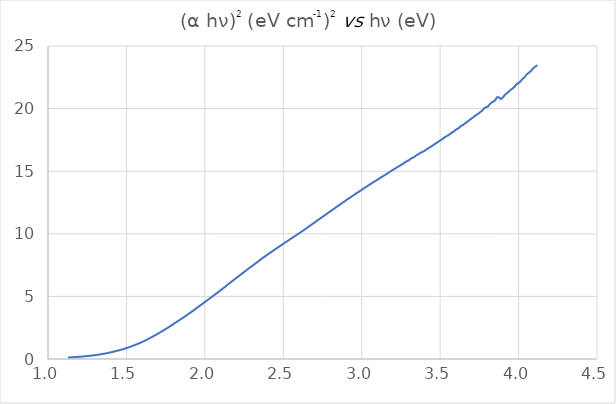
| Category | Series 0 |
|---|---|
| 1.12727 | 0.115 |
| 1.1283 | 0.116 |
| 1.12933 | 0.116 |
| 1.13036 | 0.117 |
| 1.13139 | 0.118 |
| 1.13242 | 0.119 |
| 1.13346 | 0.12 |
| 1.13449 | 0.12 |
| 1.13553 | 0.121 |
| 1.13657 | 0.122 |
| 1.13761 | 0.123 |
| 1.13866 | 0.123 |
| 1.13971 | 0.124 |
| 1.14075 | 0.125 |
| 1.1418 | 0.126 |
| 1.14286 | 0.126 |
| 1.14391 | 0.127 |
| 1.14497 | 0.128 |
| 1.14603 | 0.129 |
| 1.14709 | 0.13 |
| 1.14815 | 0.131 |
| 1.14921 | 0.131 |
| 1.15028 | 0.132 |
| 1.15135 | 0.133 |
| 1.15242 | 0.134 |
| 1.15349 | 0.135 |
| 1.15456 | 0.136 |
| 1.15564 | 0.137 |
| 1.15672 | 0.137 |
| 1.1578 | 0.138 |
| 1.15888 | 0.139 |
| 1.15996 | 0.14 |
| 1.16105 | 0.141 |
| 1.16214 | 0.142 |
| 1.16323 | 0.143 |
| 1.16432 | 0.144 |
| 1.16541 | 0.145 |
| 1.16651 | 0.146 |
| 1.16761 | 0.147 |
| 1.16871 | 0.148 |
| 1.16981 | 0.149 |
| 1.17092 | 0.15 |
| 1.17202 | 0.151 |
| 1.17313 | 0.152 |
| 1.17424 | 0.153 |
| 1.17536 | 0.154 |
| 1.17647 | 0.155 |
| 1.17759 | 0.156 |
| 1.17871 | 0.157 |
| 1.17983 | 0.158 |
| 1.18095 | 0.159 |
| 1.18208 | 0.16 |
| 1.18321 | 0.161 |
| 1.18434 | 0.162 |
| 1.18547 | 0.163 |
| 1.1866 | 0.164 |
| 1.18774 | 0.165 |
| 1.18888 | 0.166 |
| 1.19002 | 0.167 |
| 1.19116 | 0.168 |
| 1.19231 | 0.169 |
| 1.19346 | 0.171 |
| 1.19461 | 0.172 |
| 1.19576 | 0.173 |
| 1.19691 | 0.174 |
| 1.19807 | 0.175 |
| 1.19923 | 0.176 |
| 1.20039 | 0.177 |
| 1.20155 | 0.178 |
| 1.20272 | 0.18 |
| 1.20388 | 0.181 |
| 1.20505 | 0.182 |
| 1.20623 | 0.183 |
| 1.2074 | 0.184 |
| 1.20858 | 0.185 |
| 1.20976 | 0.187 |
| 1.21094 | 0.188 |
| 1.21212 | 0.189 |
| 1.21331 | 0.19 |
| 1.2145 | 0.192 |
| 1.21569 | 0.193 |
| 1.21688 | 0.194 |
| 1.21807 | 0.195 |
| 1.21927 | 0.197 |
| 1.22047 | 0.198 |
| 1.22167 | 0.199 |
| 1.22288 | 0.201 |
| 1.22409 | 0.202 |
| 1.2253 | 0.203 |
| 1.22651 | 0.205 |
| 1.22772 | 0.207 |
| 1.22894 | 0.208 |
| 1.23016 | 0.21 |
| 1.23138 | 0.211 |
| 1.2326 | 0.213 |
| 1.23383 | 0.214 |
| 1.23506 | 0.215 |
| 1.23629 | 0.217 |
| 1.23752 | 0.218 |
| 1.23876 | 0.22 |
| 1.24 | 0.221 |
| 1.24124 | 0.223 |
| 1.24248 | 0.224 |
| 1.24373 | 0.226 |
| 1.24498 | 0.227 |
| 1.24623 | 0.229 |
| 1.24748 | 0.23 |
| 1.24874 | 0.232 |
| 1.25 | 0.234 |
| 1.25126 | 0.235 |
| 1.25253 | 0.237 |
| 1.25379 | 0.239 |
| 1.25506 | 0.24 |
| 1.25633 | 0.242 |
| 1.25761 | 0.244 |
| 1.25888 | 0.245 |
| 1.26016 | 0.247 |
| 1.26144 | 0.249 |
| 1.26273 | 0.25 |
| 1.26402 | 0.252 |
| 1.26531 | 0.254 |
| 1.2666 | 0.256 |
| 1.26789 | 0.257 |
| 1.26919 | 0.259 |
| 1.27049 | 0.261 |
| 1.27179 | 0.263 |
| 1.2731 | 0.265 |
| 1.27441 | 0.267 |
| 1.27572 | 0.268 |
| 1.27703 | 0.27 |
| 1.27835 | 0.272 |
| 1.27967 | 0.274 |
| 1.28099 | 0.276 |
| 1.28232 | 0.278 |
| 1.28364 | 0.28 |
| 1.28497 | 0.282 |
| 1.28631 | 0.284 |
| 1.28764 | 0.286 |
| 1.28898 | 0.288 |
| 1.29032 | 0.29 |
| 1.29167 | 0.293 |
| 1.29301 | 0.295 |
| 1.29436 | 0.297 |
| 1.29572 | 0.299 |
| 1.29707 | 0.301 |
| 1.29843 | 0.305 |
| 1.29979 | 0.307 |
| 1.30115 | 0.31 |
| 1.30252 | 0.312 |
| 1.30389 | 0.314 |
| 1.30526 | 0.316 |
| 1.30664 | 0.319 |
| 1.30802 | 0.321 |
| 1.3094 | 0.324 |
| 1.31078 | 0.326 |
| 1.31217 | 0.328 |
| 1.31356 | 0.331 |
| 1.31495 | 0.333 |
| 1.31635 | 0.336 |
| 1.31775 | 0.338 |
| 1.31915 | 0.341 |
| 1.32055 | 0.344 |
| 1.32196 | 0.346 |
| 1.32337 | 0.349 |
| 1.32479 | 0.352 |
| 1.3262 | 0.354 |
| 1.32762 | 0.357 |
| 1.32905 | 0.36 |
| 1.33047 | 0.363 |
| 1.3319 | 0.366 |
| 1.33333 | 0.369 |
| 1.33477 | 0.371 |
| 1.33621 | 0.374 |
| 1.33765 | 0.377 |
| 1.33909 | 0.38 |
| 1.34054 | 0.383 |
| 1.34199 | 0.386 |
| 1.34345 | 0.39 |
| 1.3449 | 0.393 |
| 1.34636 | 0.396 |
| 1.34783 | 0.399 |
| 1.34929 | 0.402 |
| 1.35076 | 0.405 |
| 1.35224 | 0.409 |
| 1.35371 | 0.412 |
| 1.35519 | 0.416 |
| 1.35667 | 0.419 |
| 1.35816 | 0.422 |
| 1.35965 | 0.426 |
| 1.36114 | 0.43 |
| 1.36264 | 0.433 |
| 1.36414 | 0.437 |
| 1.36564 | 0.441 |
| 1.36714 | 0.444 |
| 1.36865 | 0.448 |
| 1.37017 | 0.452 |
| 1.37168 | 0.456 |
| 1.3732 | 0.46 |
| 1.37472 | 0.463 |
| 1.37625 | 0.467 |
| 1.37778 | 0.471 |
| 1.37931 | 0.477 |
| 1.38085 | 0.481 |
| 1.38239 | 0.485 |
| 1.38393 | 0.489 |
| 1.38547 | 0.493 |
| 1.38702 | 0.498 |
| 1.38858 | 0.502 |
| 1.39013 | 0.506 |
| 1.39169 | 0.51 |
| 1.39326 | 0.515 |
| 1.39483 | 0.519 |
| 1.3964 | 0.523 |
| 1.39797 | 0.528 |
| 1.39955 | 0.532 |
| 1.40113 | 0.536 |
| 1.40271 | 0.541 |
| 1.4043 | 0.546 |
| 1.4059 | 0.55 |
| 1.40749 | 0.555 |
| 1.40909 | 0.559 |
| 1.41069 | 0.564 |
| 1.4123 | 0.569 |
| 1.41391 | 0.574 |
| 1.41553 | 0.579 |
| 1.41714 | 0.583 |
| 1.41876 | 0.588 |
| 1.42039 | 0.593 |
| 1.42202 | 0.598 |
| 1.42365 | 0.603 |
| 1.42529 | 0.607 |
| 1.42693 | 0.612 |
| 1.42857 | 0.617 |
| 1.43022 | 0.622 |
| 1.43187 | 0.627 |
| 1.43353 | 0.634 |
| 1.43519 | 0.641 |
| 1.43685 | 0.647 |
| 1.43852 | 0.652 |
| 1.44019 | 0.657 |
| 1.44186 | 0.662 |
| 1.44354 | 0.668 |
| 1.44522 | 0.673 |
| 1.44691 | 0.679 |
| 1.4486 | 0.684 |
| 1.45029 | 0.69 |
| 1.45199 | 0.695 |
| 1.45369 | 0.701 |
| 1.4554 | 0.707 |
| 1.45711 | 0.713 |
| 1.45882 | 0.719 |
| 1.46054 | 0.724 |
| 1.46226 | 0.73 |
| 1.46399 | 0.736 |
| 1.46572 | 0.742 |
| 1.46746 | 0.748 |
| 1.46919 | 0.754 |
| 1.47094 | 0.76 |
| 1.47268 | 0.765 |
| 1.47444 | 0.772 |
| 1.47619 | 0.778 |
| 1.47795 | 0.785 |
| 1.47971 | 0.792 |
| 1.48148 | 0.799 |
| 1.48325 | 0.806 |
| 1.48503 | 0.813 |
| 1.48681 | 0.82 |
| 1.4886 | 0.827 |
| 1.49038 | 0.834 |
| 1.49218 | 0.841 |
| 1.49398 | 0.848 |
| 1.49578 | 0.856 |
| 1.49758 | 0.863 |
| 1.4994 | 0.869 |
| 1.50121 | 0.877 |
| 1.50303 | 0.884 |
| 1.50485 | 0.891 |
| 1.50668 | 0.898 |
| 1.50852 | 0.906 |
| 1.51035 | 0.913 |
| 1.5122 | 0.92 |
| 1.51404 | 0.928 |
| 1.51589 | 0.936 |
| 1.51775 | 0.944 |
| 1.51961 | 0.951 |
| 1.52147 | 0.959 |
| 1.52334 | 0.968 |
| 1.52522 | 0.976 |
| 1.52709 | 0.984 |
| 1.52898 | 0.992 |
| 1.53086 | 1.005 |
| 1.53276 | 1.015 |
| 1.53465 | 1.024 |
| 1.53656 | 1.032 |
| 1.53846 | 1.041 |
| 1.54037 | 1.05 |
| 1.54229 | 1.059 |
| 1.54421 | 1.068 |
| 1.54613 | 1.077 |
| 1.54806 | 1.086 |
| 1.55 | 1.095 |
| 1.55194 | 1.105 |
| 1.55388 | 1.114 |
| 1.55583 | 1.124 |
| 1.55779 | 1.134 |
| 1.55975 | 1.144 |
| 1.56171 | 1.154 |
| 1.56368 | 1.164 |
| 1.56566 | 1.175 |
| 1.56764 | 1.185 |
| 1.56962 | 1.195 |
| 1.57161 | 1.205 |
| 1.5736 | 1.215 |
| 1.5756 | 1.226 |
| 1.57761 | 1.236 |
| 1.57962 | 1.247 |
| 1.58163 | 1.258 |
| 1.58365 | 1.269 |
| 1.58568 | 1.28 |
| 1.58771 | 1.291 |
| 1.58974 | 1.302 |
| 1.59178 | 1.313 |
| 1.59383 | 1.325 |
| 1.59588 | 1.336 |
| 1.59794 | 1.348 |
| 1.6 | 1.359 |
| 1.60207 | 1.371 |
| 1.60414 | 1.383 |
| 1.60622 | 1.396 |
| 1.6083 | 1.407 |
| 1.61039 | 1.42 |
| 1.61248 | 1.432 |
| 1.61458 | 1.445 |
| 1.61669 | 1.457 |
| 1.6188 | 1.47 |
| 1.62092 | 1.483 |
| 1.62304 | 1.496 |
| 1.62516 | 1.508 |
| 1.6273 | 1.521 |
| 1.62943 | 1.535 |
| 1.63158 | 1.548 |
| 1.63373 | 1.562 |
| 1.63588 | 1.575 |
| 1.63804 | 1.589 |
| 1.64021 | 1.601 |
| 1.64238 | 1.622 |
| 1.64456 | 1.639 |
| 1.64675 | 1.653 |
| 1.64894 | 1.667 |
| 1.65113 | 1.682 |
| 1.65333 | 1.696 |
| 1.65554 | 1.711 |
| 1.65775 | 1.726 |
| 1.65997 | 1.741 |
| 1.6622 | 1.756 |
| 1.66443 | 1.771 |
| 1.66667 | 1.786 |
| 1.66891 | 1.801 |
| 1.67116 | 1.816 |
| 1.67341 | 1.832 |
| 1.67568 | 1.848 |
| 1.67794 | 1.864 |
| 1.68022 | 1.88 |
| 1.6825 | 1.896 |
| 1.68478 | 1.912 |
| 1.68707 | 1.928 |
| 1.68937 | 1.945 |
| 1.69168 | 1.961 |
| 1.69399 | 1.977 |
| 1.69631 | 1.994 |
| 1.69863 | 2.01 |
| 1.70096 | 2.027 |
| 1.7033 | 2.044 |
| 1.70564 | 2.061 |
| 1.70799 | 2.078 |
| 1.71034 | 2.094 |
| 1.71271 | 2.112 |
| 1.71508 | 2.129 |
| 1.71745 | 2.147 |
| 1.71983 | 2.164 |
| 1.72222 | 2.181 |
| 1.72462 | 2.199 |
| 1.72702 | 2.217 |
| 1.72943 | 2.235 |
| 1.73184 | 2.253 |
| 1.73427 | 2.272 |
| 1.73669 | 2.29 |
| 1.73913 | 2.309 |
| 1.74157 | 2.327 |
| 1.74402 | 2.346 |
| 1.74648 | 2.365 |
| 1.74894 | 2.383 |
| 1.75141 | 2.403 |
| 1.75389 | 2.422 |
| 1.75637 | 2.441 |
| 1.75887 | 2.46 |
| 1.76136 | 2.48 |
| 1.76387 | 2.499 |
| 1.76638 | 2.518 |
| 1.7689 | 2.537 |
| 1.77143 | 2.556 |
| 1.77396 | 2.58 |
| 1.7765 | 2.6 |
| 1.77905 | 2.62 |
| 1.78161 | 2.64 |
| 1.78417 | 2.66 |
| 1.78674 | 2.68 |
| 1.78932 | 2.701 |
| 1.79191 | 2.721 |
| 1.7945 | 2.742 |
| 1.7971 | 2.77 |
| 1.79971 | 2.796 |
| 1.80233 | 2.817 |
| 1.80495 | 2.838 |
| 1.80758 | 2.86 |
| 1.81022 | 2.881 |
| 1.81287 | 2.903 |
| 1.81552 | 2.925 |
| 1.81818 | 2.946 |
| 1.82085 | 2.968 |
| 1.82353 | 2.99 |
| 1.82622 | 3.012 |
| 1.82891 | 3.034 |
| 1.83161 | 3.056 |
| 1.83432 | 3.078 |
| 1.83704 | 3.101 |
| 1.83976 | 3.124 |
| 1.8425 | 3.147 |
| 1.84524 | 3.169 |
| 1.84799 | 3.192 |
| 1.85075 | 3.215 |
| 1.85351 | 3.238 |
| 1.85629 | 3.261 |
| 1.85907 | 3.284 |
| 1.86186 | 3.308 |
| 1.86466 | 3.332 |
| 1.86747 | 3.356 |
| 1.87029 | 3.38 |
| 1.87311 | 3.405 |
| 1.87595 | 3.429 |
| 1.87879 | 3.453 |
| 1.88164 | 3.477 |
| 1.8845 | 3.502 |
| 1.88737 | 3.527 |
| 1.89024 | 3.552 |
| 1.89313 | 3.578 |
| 1.89602 | 3.603 |
| 1.89893 | 3.628 |
| 1.90184 | 3.654 |
| 1.90476 | 3.679 |
| 1.90769 | 3.705 |
| 1.91063 | 3.73 |
| 1.91358 | 3.756 |
| 1.91654 | 3.782 |
| 1.9195 | 3.808 |
| 1.92248 | 3.834 |
| 1.92547 | 3.86 |
| 1.92846 | 3.887 |
| 1.93146 | 3.914 |
| 1.93448 | 3.941 |
| 1.9375 | 3.968 |
| 1.94053 | 3.995 |
| 1.94357 | 4.023 |
| 1.94662 | 4.05 |
| 1.94969 | 4.077 |
| 1.95276 | 4.104 |
| 1.95584 | 4.145 |
| 1.95893 | 4.175 |
| 1.96203 | 4.203 |
| 1.96513 | 4.232 |
| 1.96825 | 4.26 |
| 1.97138 | 4.289 |
| 1.97452 | 4.317 |
| 1.97767 | 4.346 |
| 1.98083 | 4.375 |
| 1.984 | 4.404 |
| 1.98718 | 4.433 |
| 1.99037 | 4.462 |
| 1.99357 | 4.491 |
| 1.99678 | 4.52 |
| 2.0 | 4.549 |
| 2.00323 | 4.58 |
| 2.00647 | 4.609 |
| 2.00972 | 4.64 |
| 2.01299 | 4.669 |
| 2.01626 | 4.699 |
| 2.01954 | 4.73 |
| 2.02284 | 4.76 |
| 2.02614 | 4.791 |
| 2.02946 | 4.822 |
| 2.03279 | 4.853 |
| 2.03612 | 4.884 |
| 2.03947 | 4.915 |
| 2.04283 | 4.947 |
| 2.0462 | 4.979 |
| 2.04959 | 5.011 |
| 2.05298 | 5.043 |
| 2.05638 | 5.075 |
| 2.0598 | 5.107 |
| 2.06323 | 5.139 |
| 2.06667 | 5.172 |
| 2.07012 | 5.204 |
| 2.07358 | 5.237 |
| 2.07705 | 5.27 |
| 2.08054 | 5.302 |
| 2.08403 | 5.335 |
| 2.08754 | 5.368 |
| 2.09106 | 5.401 |
| 2.09459 | 5.435 |
| 2.09814 | 5.468 |
| 2.10169 | 5.502 |
| 2.10526 | 5.535 |
| 2.10884 | 5.57 |
| 2.11244 | 5.604 |
| 2.11604 | 5.639 |
| 2.11966 | 5.673 |
| 2.12329 | 5.708 |
| 2.12693 | 5.743 |
| 2.13058 | 5.778 |
| 2.13425 | 5.813 |
| 2.13793 | 5.851 |
| 2.14162 | 5.9 |
| 2.14533 | 5.936 |
| 2.14905 | 5.972 |
| 2.15278 | 6.008 |
| 2.15652 | 6.045 |
| 2.16028 | 6.083 |
| 2.16405 | 6.118 |
| 2.16783 | 6.154 |
| 2.17163 | 6.192 |
| 2.17544 | 6.228 |
| 2.17926 | 6.264 |
| 2.1831 | 6.304 |
| 2.18695 | 6.339 |
| 2.19081 | 6.377 |
| 2.19469 | 6.413 |
| 2.19858 | 6.451 |
| 2.20249 | 6.49 |
| 2.20641 | 6.527 |
| 2.21034 | 6.563 |
| 2.21429 | 6.604 |
| 2.21825 | 6.64 |
| 2.22222 | 6.679 |
| 2.22621 | 6.719 |
| 2.23022 | 6.756 |
| 2.23423 | 6.796 |
| 2.23827 | 6.835 |
| 2.24231 | 6.873 |
| 2.24638 | 6.912 |
| 2.25045 | 6.951 |
| 2.25455 | 6.99 |
| 2.25865 | 7.029 |
| 2.26277 | 7.067 |
| 2.26691 | 7.107 |
| 2.27106 | 7.147 |
| 2.27523 | 7.187 |
| 2.27941 | 7.228 |
| 2.28361 | 7.267 |
| 2.28782 | 7.306 |
| 2.29205 | 7.347 |
| 2.2963 | 7.386 |
| 2.30056 | 7.425 |
| 2.30483 | 7.465 |
| 2.30912 | 7.505 |
| 2.31343 | 7.544 |
| 2.31776 | 7.584 |
| 2.3221 | 7.625 |
| 2.32645 | 7.665 |
| 2.33083 | 7.707 |
| 2.33522 | 7.747 |
| 2.33962 | 7.788 |
| 2.34405 | 7.83 |
| 2.34848 | 7.871 |
| 2.35294 | 7.912 |
| 2.35741 | 7.953 |
| 2.3619 | 8 |
| 2.36641 | 8.046 |
| 2.37094 | 8.087 |
| 2.37548 | 8.126 |
| 2.38004 | 8.167 |
| 2.38462 | 8.209 |
| 2.38921 | 8.25 |
| 2.39382 | 8.289 |
| 2.39845 | 8.329 |
| 2.4031 | 8.37 |
| 2.40777 | 8.41 |
| 2.41245 | 8.449 |
| 2.41715 | 8.488 |
| 2.42188 | 8.53 |
| 2.42661 | 8.573 |
| 2.43137 | 8.616 |
| 2.43615 | 8.659 |
| 2.44094 | 8.702 |
| 2.44576 | 8.744 |
| 2.45059 | 8.785 |
| 2.45545 | 8.827 |
| 2.46032 | 8.868 |
| 2.46521 | 8.911 |
| 2.47012 | 8.95 |
| 2.47505 | 8.989 |
| 2.48 | 9.032 |
| 2.48497 | 9.073 |
| 2.48996 | 9.115 |
| 2.49497 | 9.155 |
| 2.5 | 9.198 |
| 2.50505 | 9.243 |
| 2.51012 | 9.285 |
| 2.51521 | 9.327 |
| 2.52033 | 9.372 |
| 2.52546 | 9.414 |
| 2.53061 | 9.455 |
| 2.53579 | 9.501 |
| 2.54098 | 9.544 |
| 2.5462 | 9.587 |
| 2.55144 | 9.632 |
| 2.5567 | 9.672 |
| 2.56198 | 9.719 |
| 2.56729 | 9.761 |
| 2.57261 | 9.807 |
| 2.57796 | 9.849 |
| 2.58333 | 9.893 |
| 2.58873 | 9.938 |
| 2.59414 | 9.983 |
| 2.59958 | 10.031 |
| 2.60504 | 10.074 |
| 2.61053 | 10.126 |
| 2.61603 | 10.17 |
| 2.62156 | 10.215 |
| 2.62712 | 10.262 |
| 2.6327 | 10.309 |
| 2.6383 | 10.358 |
| 2.64392 | 10.417 |
| 2.64957 | 10.467 |
| 2.65525 | 10.516 |
| 2.66094 | 10.564 |
| 2.66667 | 10.615 |
| 2.67241 | 10.665 |
| 2.67819 | 10.714 |
| 2.68398 | 10.768 |
| 2.6898 | 10.819 |
| 2.69565 | 10.867 |
| 2.70153 | 10.918 |
| 2.70742 | 10.972 |
| 2.71335 | 11.027 |
| 2.7193 | 11.08 |
| 2.72527 | 11.134 |
| 2.73128 | 11.189 |
| 2.73731 | 11.241 |
| 2.74336 | 11.295 |
| 2.74945 | 11.351 |
| 2.75556 | 11.402 |
| 2.76169 | 11.455 |
| 2.76786 | 11.511 |
| 2.77405 | 11.565 |
| 2.78027 | 11.617 |
| 2.78652 | 11.673 |
| 2.79279 | 11.729 |
| 2.7991 | 11.787 |
| 2.80543 | 11.843 |
| 2.81179 | 11.896 |
| 2.81818 | 11.953 |
| 2.8246 | 12.01 |
| 2.83105 | 12.07 |
| 2.83753 | 12.127 |
| 2.84404 | 12.187 |
| 2.85057 | 12.245 |
| 2.85714 | 12.3 |
| 2.86374 | 12.356 |
| 2.87037 | 12.413 |
| 2.87703 | 12.47 |
| 2.88372 | 12.534 |
| 2.89044 | 12.587 |
| 2.8972 | 12.644 |
| 2.90398 | 12.708 |
| 2.9108 | 12.767 |
| 2.91765 | 12.827 |
| 2.92453 | 12.882 |
| 2.93144 | 12.937 |
| 2.93839 | 12.997 |
| 2.94537 | 13.059 |
| 2.95238 | 13.119 |
| 2.95943 | 13.173 |
| 2.96651 | 13.237 |
| 2.97362 | 13.298 |
| 2.98077 | 13.355 |
| 2.98795 | 13.41 |
| 2.99517 | 13.476 |
| 3.00242 | 13.53 |
| 3.00971 | 13.601 |
| 3.01703 | 13.658 |
| 3.02439 | 13.719 |
| 3.03178 | 13.781 |
| 3.03922 | 13.837 |
| 3.04668 | 13.898 |
| 3.05419 | 13.958 |
| 3.06173 | 14.026 |
| 3.06931 | 14.077 |
| 3.07692 | 14.141 |
| 3.08458 | 14.201 |
| 3.09227 | 14.269 |
| 3.1 | 14.315 |
| 3.10777 | 14.383 |
| 3.11558 | 14.451 |
| 3.12343 | 14.512 |
| 3.13131 | 14.571 |
| 3.13924 | 14.628 |
| 3.14721 | 14.695 |
| 3.15522 | 14.75 |
| 3.16327 | 14.826 |
| 3.17136 | 14.881 |
| 3.17949 | 14.948 |
| 3.18766 | 15.018 |
| 3.19588 | 15.084 |
| 3.20413 | 15.149 |
| 3.21244 | 15.212 |
| 3.22078 | 15.267 |
| 3.22917 | 15.343 |
| 3.2376 | 15.399 |
| 3.24607 | 15.465 |
| 3.25459 | 15.53 |
| 3.26316 | 15.59 |
| 3.27177 | 15.675 |
| 3.28042 | 15.746 |
| 3.28912 | 15.805 |
| 3.29787 | 15.862 |
| 3.30667 | 15.931 |
| 3.31551 | 16.023 |
| 3.3244 | 16.067 |
| 3.33333 | 16.129 |
| 3.34232 | 16.207 |
| 3.35135 | 16.293 |
| 3.36043 | 16.349 |
| 3.36957 | 16.426 |
| 3.37875 | 16.484 |
| 3.38798 | 16.544 |
| 3.39726 | 16.607 |
| 3.40659 | 16.685 |
| 3.41598 | 16.766 |
| 3.42541 | 16.832 |
| 3.4349 | 16.914 |
| 3.44444 | 16.978 |
| 3.45404 | 17.066 |
| 3.46369 | 17.153 |
| 3.47339 | 17.23 |
| 3.48315 | 17.307 |
| 3.49296 | 17.398 |
| 3.50282 | 17.481 |
| 3.51275 | 17.547 |
| 3.52273 | 17.659 |
| 3.53276 | 17.732 |
| 3.54286 | 17.818 |
| 3.55301 | 17.871 |
| 3.56322 | 17.978 |
| 3.57349 | 18.082 |
| 3.58382 | 18.143 |
| 3.5942 | 18.244 |
| 3.60465 | 18.355 |
| 3.61516 | 18.413 |
| 3.62573 | 18.528 |
| 3.63636 | 18.648 |
| 3.64706 | 18.695 |
| 3.65782 | 18.821 |
| 3.66864 | 18.902 |
| 3.67953 | 19.02 |
| 3.69048 | 19.124 |
| 3.70149 | 19.225 |
| 3.71257 | 19.323 |
| 3.72372 | 19.438 |
| 3.73494 | 19.52 |
| 3.74622 | 19.624 |
| 3.75758 | 19.739 |
| 3.769 | 19.858 |
| 3.78049 | 20.03 |
| 3.79205 | 20.11 |
| 3.80368 | 20.157 |
| 3.81538 | 20.334 |
| 3.82716 | 20.476 |
| 3.83901 | 20.559 |
| 3.85093 | 20.665 |
| 3.86293 | 20.909 |
| 3.875 | 20.902 |
| 3.88715 | 20.76 |
| 3.89937 | 20.88 |
| 3.91167 | 21.083 |
| 3.92405 | 21.21 |
| 3.93651 | 21.344 |
| 3.94904 | 21.484 |
| 3.96166 | 21.606 |
| 3.97436 | 21.742 |
| 3.98714 | 21.953 |
| 4.0 | 22.033 |
| 4.01294 | 22.181 |
| 4.02597 | 22.387 |
| 4.03909 | 22.519 |
| 4.05229 | 22.729 |
| 4.06557 | 22.866 |
| 4.07895 | 23.003 |
| 4.09241 | 23.212 |
| 4.10596 | 23.349 |
| 4.1196 | 23.461 |